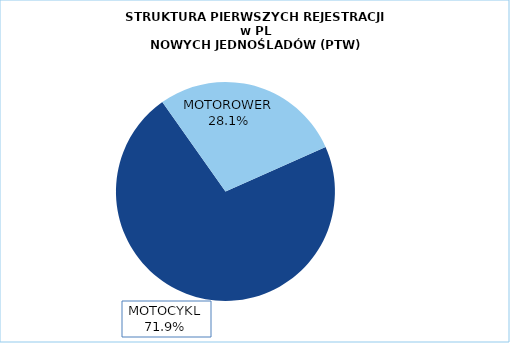
| Category | RAZEM |
|---|---|
|  MOTOCYKL  | 0.719 |
|  MOTOROWER  | 0.281 |